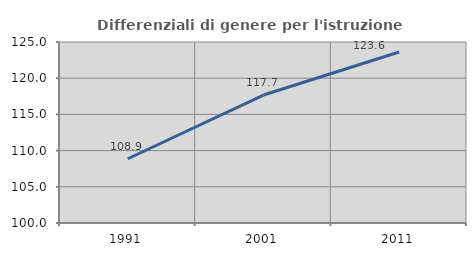
| Category | Differenziali di genere per l'istruzione superiore |
|---|---|
| 1991.0 | 108.876 |
| 2001.0 | 117.675 |
| 2011.0 | 123.614 |